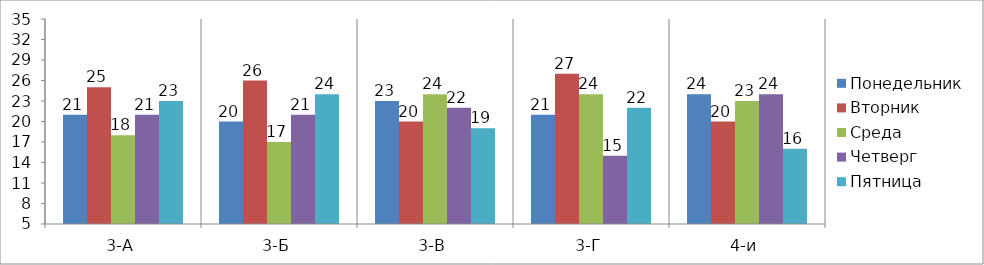
| Category | Понедельник | Вторник | Среда | Четверг | Пятница |
|---|---|---|---|---|---|
| 3-А | 21 | 25 | 18 | 21 | 23 |
| 3-Б | 20 | 26 | 17 | 21 | 24 |
| 3-В | 23 | 20 | 24 | 22 | 19 |
| 3-Г | 21 | 27 | 24 | 15 | 22 |
| 4-и | 24 | 20 | 23 | 24 | 16 |